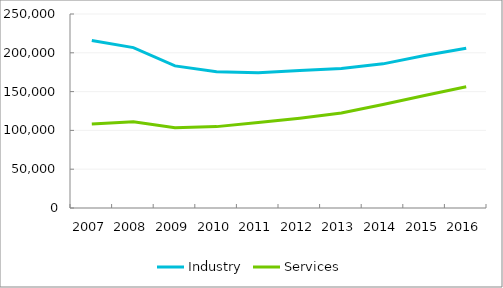
| Category | Industry | Services |
|---|---|---|
| 2007.0 | 215878 | 108227 |
| 2008.0 | 206720 | 111261 |
| 2009.0 | 183099 | 103531 |
| 2010.0 | 175652 | 104868 |
| 2011.0 | 174346 | 110108 |
| 2012.0 | 177116 | 115753 |
| 2013.0 | 179916 | 122485 |
| 2014.0 | 185742 | 133342 |
| 2015.0 | 196489 | 144923 |
| 2016.0 | 205847 | 156197 |